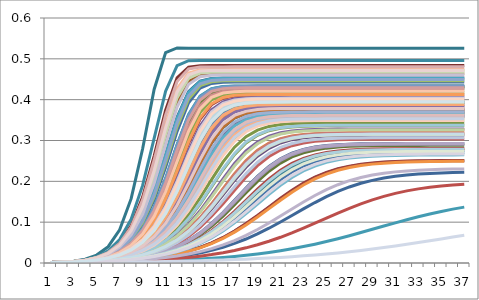
| Category | Series 0 | Series 1 | Series 2 | Series 3 | Series 4 | Series 5 | Series 6 | Series 7 | Series 8 | Series 9 | Series 10 | Series 11 | Series 12 | Series 13 | Series 14 | Series 15 | Series 16 | Series 17 | Series 18 | Series 19 | Series 20 | Series 21 | Series 22 | Series 23 | Series 24 | Series 25 | Series 26 | Series 27 | Series 28 | Series 29 | Series 30 | Series 31 | Series 32 | Series 33 | Series 34 | Series 35 | Series 36 | Series 37 | Series 38 | Series 39 | Series 40 | Series 41 | Series 42 | Series 43 | Series 44 | Series 45 | Series 46 | Series 47 | Series 48 | Series 49 | Series 50 | Series 51 | Series 52 | Series 53 | Series 54 | Series 55 | Series 56 | Series 57 | Series 58 | Series 59 | Series 60 | Series 61 | Series 62 | Series 63 | Series 64 | Series 65 | Series 66 | Series 67 | Series 68 | Series 69 | Series 70 | Series 71 | Series 72 | Series 73 | Series 74 | Series 75 | Series 76 | Series 77 | Series 78 | Series 79 | Series 80 | Series 81 | Series 82 | Series 83 | Series 84 | Series 85 | Series 86 | Series 87 | Series 88 | Series 89 | Series 90 | Series 91 | Series 92 | Series 93 | Series 94 |
|---|---|---|---|---|---|---|---|---|---|---|---|---|---|---|---|---|---|---|---|---|---|---|---|---|---|---|---|---|---|---|---|---|---|---|---|---|---|---|---|---|---|---|---|---|---|---|---|---|---|---|---|---|---|---|---|---|---|---|---|---|---|---|---|---|---|---|---|---|---|---|---|---|---|---|---|---|---|---|---|---|---|---|---|---|---|---|---|---|---|---|---|---|---|---|---|
| 0 | 0.001 | 0.001 | 0.001 | 0.001 | 0.001 | 0.001 | 0.001 | 0.001 | 0.001 | 0.001 | 0.001 | 0.001 | 0.001 | 0.001 | 0.001 | 0.001 | 0.001 | 0.001 | 0.001 | 0.001 | 0.001 | 0.001 | 0.001 | 0.001 | 0.001 | 0.001 | 0.001 | 0.001 | 0.001 | 0.001 | 0.001 | 0.001 | 0.001 | 0.001 | 0.001 | 0.001 | 0.001 | 0.001 | 0.001 | 0.001 | 0.001 | 0.001 | 0.001 | 0.001 | 0.001 | 0.001 | 0.001 | 0.001 | 0.001 | 0.001 | 0.001 | 0.001 | 0.001 | 0.001 | 0.001 | 0.001 | 0.001 | 0.001 | 0.001 | 0.001 | 0.001 | 0.001 | 0.001 | 0.001 | 0.001 | 0.001 | 0.001 | 0.001 | 0.001 | 0.001 | 0.001 | 0.001 | 0.001 | 0.001 | 0.001 | 0.001 | 0.001 | 0.001 | 0.001 | 0.001 | 0.001 | 0.001 | 0.001 | 0.001 | 0.001 | 0.001 | 0.001 | 0.001 | 0.001 | 0.001 | 0.001 | 0.001 | 0.001 | 0.001 | 0.001 |
| 1 | 0.002 | 0.002 | 0.001 | 0.002 | 0.002 | 0.002 | 0.002 | 0.002 | 0.002 | 0.001 | 0.002 | 0.002 | 0.001 | 0.002 | 0.002 | 0.002 | 0.001 | 0.002 | 0.001 | 0.001 | 0.002 | 0.001 | 0.002 | 0.001 | 0.002 | 0.002 | 0.002 | 0.002 | 0.002 | 0.001 | 0.001 | 0.001 | 0.002 | 0.001 | 0.001 | 0.001 | 0.002 | 0.002 | 0.002 | 0.002 | 0.002 | 0.002 | 0.002 | 0.001 | 0.002 | 0.001 | 0.002 | 0.001 | 0.002 | 0.001 | 0.002 | 0.002 | 0.002 | 0.002 | 0.002 | 0.001 | 0.002 | 0.002 | 0.001 | 0.002 | 0.002 | 0.002 | 0.002 | 0.001 | 0.002 | 0.002 | 0.002 | 0.002 | 0.001 | 0.001 | 0.002 | 0.002 | 0.002 | 0.002 | 0.002 | 0.001 | 0.001 | 0.002 | 0.001 | 0.002 | 0.001 | 0.002 | 0.002 | 0.002 | 0.002 | 0.002 | 0.002 | 0.002 | 0.001 | 0.002 | 0.001 | 0.002 | 0.001 | 0.001 | 0.002 |
| 2 | 0.003 | 0.004 | 0.002 | 0.003 | 0.002 | 0.003 | 0.003 | 0.003 | 0.003 | 0.002 | 0.004 | 0.002 | 0.002 | 0.003 | 0.003 | 0.003 | 0.002 | 0.003 | 0.002 | 0.002 | 0.002 | 0.002 | 0.004 | 0.002 | 0.003 | 0.003 | 0.002 | 0.003 | 0.003 | 0.002 | 0.002 | 0.002 | 0.003 | 0.002 | 0.001 | 0.002 | 0.002 | 0.002 | 0.003 | 0.003 | 0.003 | 0.003 | 0.003 | 0.002 | 0.004 | 0.002 | 0.003 | 0.002 | 0.003 | 0.002 | 0.003 | 0.003 | 0.002 | 0.003 | 0.003 | 0.002 | 0.002 | 0.002 | 0.002 | 0.003 | 0.003 | 0.003 | 0.003 | 0.002 | 0.002 | 0.002 | 0.003 | 0.003 | 0.002 | 0.002 | 0.002 | 0.004 | 0.002 | 0.004 | 0.004 | 0.002 | 0.002 | 0.003 | 0.002 | 0.002 | 0.002 | 0.003 | 0.003 | 0.002 | 0.002 | 0.003 | 0.003 | 0.003 | 0.002 | 0.003 | 0.001 | 0.004 | 0.002 | 0.002 | 0.003 |
| 3 | 0.004 | 0.007 | 0.003 | 0.004 | 0.004 | 0.006 | 0.006 | 0.005 | 0.005 | 0.002 | 0.009 | 0.004 | 0.003 | 0.004 | 0.005 | 0.005 | 0.003 | 0.004 | 0.002 | 0.002 | 0.004 | 0.003 | 0.008 | 0.003 | 0.006 | 0.005 | 0.003 | 0.004 | 0.004 | 0.003 | 0.003 | 0.003 | 0.005 | 0.003 | 0.002 | 0.003 | 0.004 | 0.004 | 0.005 | 0.005 | 0.005 | 0.004 | 0.004 | 0.002 | 0.007 | 0.003 | 0.006 | 0.002 | 0.004 | 0.003 | 0.006 | 0.004 | 0.004 | 0.005 | 0.005 | 0.003 | 0.004 | 0.004 | 0.003 | 0.004 | 0.006 | 0.005 | 0.004 | 0.003 | 0.004 | 0.004 | 0.004 | 0.005 | 0.003 | 0.003 | 0.003 | 0.007 | 0.004 | 0.007 | 0.007 | 0.002 | 0.003 | 0.005 | 0.003 | 0.004 | 0.003 | 0.006 | 0.005 | 0.004 | 0.004 | 0.004 | 0.004 | 0.005 | 0.003 | 0.005 | 0.001 | 0.007 | 0.003 | 0.003 | 0.004 |
| 4 | 0.006 | 0.014 | 0.004 | 0.007 | 0.006 | 0.012 | 0.011 | 0.008 | 0.009 | 0.003 | 0.019 | 0.006 | 0.004 | 0.007 | 0.009 | 0.01 | 0.004 | 0.007 | 0.003 | 0.003 | 0.005 | 0.004 | 0.015 | 0.004 | 0.01 | 0.008 | 0.005 | 0.006 | 0.007 | 0.005 | 0.004 | 0.004 | 0.009 | 0.005 | 0.002 | 0.005 | 0.006 | 0.006 | 0.009 | 0.008 | 0.01 | 0.007 | 0.007 | 0.002 | 0.013 | 0.005 | 0.011 | 0.003 | 0.007 | 0.004 | 0.011 | 0.007 | 0.006 | 0.008 | 0.01 | 0.005 | 0.006 | 0.006 | 0.003 | 0.007 | 0.011 | 0.009 | 0.007 | 0.004 | 0.006 | 0.006 | 0.006 | 0.009 | 0.005 | 0.004 | 0.005 | 0.013 | 0.006 | 0.014 | 0.012 | 0.003 | 0.004 | 0.009 | 0.004 | 0.006 | 0.004 | 0.012 | 0.008 | 0.006 | 0.006 | 0.007 | 0.007 | 0.008 | 0.005 | 0.008 | 0.002 | 0.013 | 0.004 | 0.003 | 0.007 |
| 5 | 0.01 | 0.026 | 0.005 | 0.011 | 0.01 | 0.022 | 0.02 | 0.012 | 0.016 | 0.004 | 0.04 | 0.01 | 0.006 | 0.01 | 0.016 | 0.017 | 0.005 | 0.01 | 0.004 | 0.004 | 0.008 | 0.006 | 0.03 | 0.005 | 0.018 | 0.014 | 0.008 | 0.01 | 0.012 | 0.007 | 0.005 | 0.005 | 0.015 | 0.007 | 0.002 | 0.007 | 0.009 | 0.009 | 0.017 | 0.013 | 0.017 | 0.011 | 0.012 | 0.003 | 0.024 | 0.007 | 0.02 | 0.004 | 0.012 | 0.006 | 0.019 | 0.011 | 0.01 | 0.014 | 0.017 | 0.007 | 0.009 | 0.009 | 0.005 | 0.011 | 0.019 | 0.015 | 0.012 | 0.006 | 0.009 | 0.009 | 0.01 | 0.016 | 0.007 | 0.006 | 0.008 | 0.024 | 0.009 | 0.026 | 0.023 | 0.004 | 0.005 | 0.015 | 0.006 | 0.009 | 0.007 | 0.021 | 0.012 | 0.008 | 0.009 | 0.011 | 0.012 | 0.013 | 0.007 | 0.013 | 0.002 | 0.024 | 0.005 | 0.005 | 0.012 |
| 6 | 0.016 | 0.05 | 0.008 | 0.018 | 0.015 | 0.04 | 0.036 | 0.02 | 0.027 | 0.006 | 0.081 | 0.015 | 0.008 | 0.017 | 0.028 | 0.029 | 0.007 | 0.016 | 0.005 | 0.006 | 0.012 | 0.009 | 0.057 | 0.007 | 0.032 | 0.023 | 0.011 | 0.015 | 0.019 | 0.011 | 0.007 | 0.007 | 0.025 | 0.01 | 0.003 | 0.01 | 0.014 | 0.014 | 0.029 | 0.022 | 0.029 | 0.018 | 0.019 | 0.004 | 0.044 | 0.011 | 0.036 | 0.006 | 0.019 | 0.009 | 0.033 | 0.018 | 0.015 | 0.024 | 0.029 | 0.01 | 0.013 | 0.014 | 0.006 | 0.019 | 0.034 | 0.026 | 0.02 | 0.008 | 0.014 | 0.014 | 0.016 | 0.028 | 0.01 | 0.008 | 0.012 | 0.045 | 0.014 | 0.048 | 0.042 | 0.005 | 0.007 | 0.026 | 0.009 | 0.014 | 0.009 | 0.039 | 0.02 | 0.013 | 0.013 | 0.017 | 0.02 | 0.022 | 0.01 | 0.021 | 0.002 | 0.044 | 0.007 | 0.006 | 0.02 |
| 7 | 0.026 | 0.092 | 0.011 | 0.029 | 0.024 | 0.072 | 0.063 | 0.033 | 0.046 | 0.007 | 0.158 | 0.024 | 0.011 | 0.026 | 0.049 | 0.05 | 0.009 | 0.026 | 0.006 | 0.007 | 0.018 | 0.013 | 0.107 | 0.01 | 0.056 | 0.039 | 0.017 | 0.024 | 0.031 | 0.016 | 0.009 | 0.01 | 0.041 | 0.014 | 0.003 | 0.014 | 0.022 | 0.022 | 0.049 | 0.036 | 0.05 | 0.029 | 0.031 | 0.005 | 0.08 | 0.016 | 0.063 | 0.007 | 0.031 | 0.012 | 0.058 | 0.028 | 0.023 | 0.039 | 0.049 | 0.014 | 0.02 | 0.022 | 0.008 | 0.03 | 0.06 | 0.045 | 0.032 | 0.011 | 0.022 | 0.021 | 0.024 | 0.048 | 0.015 | 0.011 | 0.017 | 0.082 | 0.022 | 0.088 | 0.075 | 0.006 | 0.01 | 0.043 | 0.013 | 0.022 | 0.014 | 0.069 | 0.033 | 0.02 | 0.02 | 0.027 | 0.032 | 0.035 | 0.014 | 0.034 | 0.003 | 0.079 | 0.009 | 0.009 | 0.032 |
| 8 | 0.04 | 0.161 | 0.015 | 0.045 | 0.037 | 0.124 | 0.108 | 0.053 | 0.077 | 0.01 | 0.28 | 0.036 | 0.015 | 0.041 | 0.081 | 0.083 | 0.013 | 0.04 | 0.007 | 0.01 | 0.027 | 0.019 | 0.19 | 0.013 | 0.095 | 0.063 | 0.025 | 0.037 | 0.05 | 0.023 | 0.012 | 0.013 | 0.068 | 0.02 | 0.004 | 0.021 | 0.033 | 0.034 | 0.082 | 0.059 | 0.084 | 0.046 | 0.05 | 0.006 | 0.139 | 0.023 | 0.107 | 0.01 | 0.049 | 0.017 | 0.099 | 0.044 | 0.036 | 0.064 | 0.082 | 0.021 | 0.03 | 0.033 | 0.011 | 0.047 | 0.103 | 0.074 | 0.051 | 0.015 | 0.034 | 0.032 | 0.038 | 0.079 | 0.023 | 0.015 | 0.026 | 0.143 | 0.033 | 0.155 | 0.13 | 0.008 | 0.013 | 0.071 | 0.018 | 0.034 | 0.02 | 0.119 | 0.053 | 0.029 | 0.031 | 0.042 | 0.051 | 0.057 | 0.02 | 0.056 | 0.003 | 0.138 | 0.012 | 0.012 | 0.051 |
| 9 | 0.062 | 0.262 | 0.02 | 0.07 | 0.056 | 0.202 | 0.176 | 0.084 | 0.125 | 0.013 | 0.425 | 0.055 | 0.021 | 0.063 | 0.131 | 0.135 | 0.017 | 0.062 | 0.009 | 0.013 | 0.041 | 0.028 | 0.305 | 0.018 | 0.154 | 0.101 | 0.037 | 0.057 | 0.078 | 0.033 | 0.016 | 0.018 | 0.109 | 0.028 | 0.005 | 0.03 | 0.05 | 0.051 | 0.132 | 0.093 | 0.136 | 0.072 | 0.079 | 0.007 | 0.226 | 0.034 | 0.175 | 0.013 | 0.077 | 0.024 | 0.161 | 0.069 | 0.054 | 0.103 | 0.133 | 0.029 | 0.045 | 0.05 | 0.015 | 0.073 | 0.167 | 0.119 | 0.079 | 0.021 | 0.051 | 0.048 | 0.058 | 0.128 | 0.033 | 0.021 | 0.038 | 0.233 | 0.05 | 0.252 | 0.213 | 0.01 | 0.018 | 0.114 | 0.026 | 0.052 | 0.028 | 0.194 | 0.084 | 0.044 | 0.046 | 0.065 | 0.08 | 0.091 | 0.029 | 0.088 | 0.003 | 0.225 | 0.017 | 0.016 | 0.08 |
| 10 | 0.092 | 0.374 | 0.028 | 0.105 | 0.084 | 0.301 | 0.266 | 0.127 | 0.19 | 0.017 | 0.515 | 0.082 | 0.03 | 0.095 | 0.201 | 0.206 | 0.024 | 0.093 | 0.012 | 0.017 | 0.06 | 0.039 | 0.421 | 0.025 | 0.234 | 0.154 | 0.054 | 0.085 | 0.119 | 0.047 | 0.022 | 0.025 | 0.167 | 0.04 | 0.006 | 0.042 | 0.074 | 0.075 | 0.202 | 0.142 | 0.207 | 0.109 | 0.119 | 0.009 | 0.332 | 0.048 | 0.264 | 0.017 | 0.117 | 0.034 | 0.245 | 0.104 | 0.081 | 0.157 | 0.204 | 0.042 | 0.066 | 0.074 | 0.021 | 0.111 | 0.253 | 0.181 | 0.121 | 0.029 | 0.075 | 0.071 | 0.086 | 0.196 | 0.047 | 0.03 | 0.055 | 0.34 | 0.075 | 0.362 | 0.315 | 0.013 | 0.025 | 0.174 | 0.036 | 0.077 | 0.04 | 0.29 | 0.128 | 0.064 | 0.068 | 0.097 | 0.121 | 0.138 | 0.041 | 0.134 | 0.004 | 0.33 | 0.023 | 0.021 | 0.122 |
| 11 | 0.134 | 0.453 | 0.038 | 0.153 | 0.121 | 0.392 | 0.357 | 0.185 | 0.269 | 0.022 | 0.527 | 0.119 | 0.041 | 0.137 | 0.282 | 0.289 | 0.032 | 0.135 | 0.015 | 0.023 | 0.085 | 0.054 | 0.483 | 0.033 | 0.322 | 0.221 | 0.077 | 0.124 | 0.173 | 0.067 | 0.03 | 0.034 | 0.239 | 0.056 | 0.007 | 0.06 | 0.107 | 0.109 | 0.283 | 0.205 | 0.29 | 0.159 | 0.173 | 0.011 | 0.42 | 0.068 | 0.355 | 0.022 | 0.17 | 0.048 | 0.334 | 0.151 | 0.117 | 0.225 | 0.286 | 0.059 | 0.096 | 0.106 | 0.027 | 0.162 | 0.343 | 0.258 | 0.175 | 0.04 | 0.109 | 0.102 | 0.125 | 0.276 | 0.066 | 0.041 | 0.078 | 0.427 | 0.108 | 0.445 | 0.405 | 0.017 | 0.033 | 0.249 | 0.05 | 0.111 | 0.056 | 0.382 | 0.185 | 0.093 | 0.098 | 0.141 | 0.176 | 0.2 | 0.057 | 0.193 | 0.004 | 0.419 | 0.031 | 0.028 | 0.177 |
| 12 | 0.186 | 0.48 | 0.051 | 0.211 | 0.169 | 0.444 | 0.42 | 0.25 | 0.343 | 0.029 | 0.526 | 0.166 | 0.055 | 0.19 | 0.356 | 0.362 | 0.043 | 0.187 | 0.02 | 0.03 | 0.119 | 0.075 | 0.495 | 0.045 | 0.392 | 0.293 | 0.107 | 0.172 | 0.235 | 0.093 | 0.04 | 0.046 | 0.312 | 0.078 | 0.008 | 0.082 | 0.149 | 0.152 | 0.357 | 0.275 | 0.364 | 0.218 | 0.236 | 0.014 | 0.461 | 0.095 | 0.418 | 0.029 | 0.232 | 0.065 | 0.402 | 0.208 | 0.163 | 0.297 | 0.359 | 0.081 | 0.133 | 0.148 | 0.036 | 0.221 | 0.409 | 0.332 | 0.239 | 0.054 | 0.151 | 0.142 | 0.174 | 0.35 | 0.092 | 0.055 | 0.109 | 0.465 | 0.151 | 0.475 | 0.452 | 0.022 | 0.045 | 0.323 | 0.068 | 0.154 | 0.077 | 0.437 | 0.251 | 0.129 | 0.137 | 0.195 | 0.239 | 0.268 | 0.078 | 0.26 | 0.005 | 0.461 | 0.041 | 0.037 | 0.24 |
| 13 | 0.242 | 0.483 | 0.069 | 0.27 | 0.222 | 0.46 | 0.445 | 0.311 | 0.394 | 0.038 | 0.526 | 0.219 | 0.074 | 0.247 | 0.403 | 0.408 | 0.056 | 0.243 | 0.025 | 0.038 | 0.159 | 0.101 | 0.496 | 0.059 | 0.428 | 0.352 | 0.144 | 0.225 | 0.296 | 0.125 | 0.052 | 0.061 | 0.369 | 0.105 | 0.01 | 0.111 | 0.197 | 0.201 | 0.404 | 0.335 | 0.409 | 0.278 | 0.297 | 0.017 | 0.471 | 0.128 | 0.444 | 0.037 | 0.293 | 0.087 | 0.434 | 0.267 | 0.215 | 0.356 | 0.406 | 0.11 | 0.178 | 0.197 | 0.047 | 0.282 | 0.439 | 0.385 | 0.3 | 0.072 | 0.201 | 0.19 | 0.228 | 0.399 | 0.124 | 0.074 | 0.146 | 0.473 | 0.2 | 0.48 | 0.465 | 0.028 | 0.059 | 0.377 | 0.092 | 0.205 | 0.104 | 0.456 | 0.312 | 0.173 | 0.183 | 0.253 | 0.3 | 0.329 | 0.106 | 0.322 | 0.006 | 0.47 | 0.054 | 0.049 | 0.302 |
| 14 | 0.294 | 0.483 | 0.09 | 0.32 | 0.273 | 0.463 | 0.452 | 0.356 | 0.417 | 0.049 | 0.526 | 0.27 | 0.097 | 0.298 | 0.423 | 0.426 | 0.073 | 0.295 | 0.031 | 0.049 | 0.204 | 0.132 | 0.496 | 0.077 | 0.44 | 0.388 | 0.186 | 0.277 | 0.343 | 0.163 | 0.068 | 0.079 | 0.4 | 0.137 | 0.011 | 0.145 | 0.247 | 0.251 | 0.424 | 0.375 | 0.427 | 0.327 | 0.344 | 0.021 | 0.472 | 0.166 | 0.451 | 0.048 | 0.341 | 0.114 | 0.444 | 0.317 | 0.266 | 0.39 | 0.425 | 0.143 | 0.226 | 0.246 | 0.061 | 0.331 | 0.447 | 0.411 | 0.346 | 0.094 | 0.251 | 0.239 | 0.28 | 0.42 | 0.161 | 0.096 | 0.189 | 0.474 | 0.25 | 0.48 | 0.467 | 0.035 | 0.077 | 0.406 | 0.12 | 0.255 | 0.136 | 0.46 | 0.357 | 0.22 | 0.231 | 0.304 | 0.347 | 0.37 | 0.138 | 0.365 | 0.006 | 0.472 | 0.071 | 0.064 | 0.348 |
| 15 | 0.332 | 0.483 | 0.115 | 0.354 | 0.314 | 0.463 | 0.453 | 0.381 | 0.424 | 0.062 | 0.526 | 0.311 | 0.124 | 0.336 | 0.429 | 0.431 | 0.094 | 0.333 | 0.039 | 0.063 | 0.247 | 0.167 | 0.496 | 0.099 | 0.442 | 0.403 | 0.228 | 0.317 | 0.371 | 0.203 | 0.087 | 0.101 | 0.412 | 0.173 | 0.014 | 0.182 | 0.29 | 0.294 | 0.43 | 0.395 | 0.432 | 0.359 | 0.372 | 0.025 | 0.472 | 0.206 | 0.452 | 0.06 | 0.37 | 0.145 | 0.446 | 0.351 | 0.307 | 0.405 | 0.43 | 0.18 | 0.269 | 0.29 | 0.079 | 0.362 | 0.449 | 0.42 | 0.374 | 0.12 | 0.294 | 0.282 | 0.32 | 0.427 | 0.201 | 0.123 | 0.231 | 0.474 | 0.293 | 0.48 | 0.467 | 0.044 | 0.098 | 0.416 | 0.153 | 0.298 | 0.171 | 0.46 | 0.381 | 0.263 | 0.274 | 0.341 | 0.374 | 0.391 | 0.174 | 0.387 | 0.007 | 0.472 | 0.09 | 0.081 | 0.375 |
| 16 | 0.355 | 0.483 | 0.143 | 0.371 | 0.341 | 0.463 | 0.453 | 0.392 | 0.427 | 0.077 | 0.526 | 0.338 | 0.153 | 0.358 | 0.431 | 0.433 | 0.118 | 0.355 | 0.048 | 0.078 | 0.284 | 0.202 | 0.496 | 0.124 | 0.443 | 0.409 | 0.266 | 0.343 | 0.385 | 0.24 | 0.108 | 0.127 | 0.416 | 0.209 | 0.016 | 0.219 | 0.321 | 0.325 | 0.431 | 0.402 | 0.433 | 0.375 | 0.385 | 0.031 | 0.472 | 0.244 | 0.453 | 0.076 | 0.383 | 0.178 | 0.446 | 0.369 | 0.335 | 0.411 | 0.432 | 0.216 | 0.304 | 0.321 | 0.098 | 0.377 | 0.449 | 0.423 | 0.386 | 0.149 | 0.324 | 0.314 | 0.345 | 0.429 | 0.238 | 0.152 | 0.268 | 0.474 | 0.324 | 0.48 | 0.467 | 0.055 | 0.123 | 0.42 | 0.187 | 0.327 | 0.207 | 0.46 | 0.392 | 0.298 | 0.308 | 0.361 | 0.387 | 0.399 | 0.21 | 0.396 | 0.008 | 0.472 | 0.113 | 0.102 | 0.387 |
| 17 | 0.366 | 0.483 | 0.172 | 0.379 | 0.356 | 0.463 | 0.453 | 0.396 | 0.427 | 0.095 | 0.526 | 0.354 | 0.184 | 0.369 | 0.431 | 0.433 | 0.143 | 0.367 | 0.059 | 0.097 | 0.31 | 0.235 | 0.496 | 0.151 | 0.443 | 0.411 | 0.294 | 0.357 | 0.39 | 0.271 | 0.133 | 0.154 | 0.417 | 0.241 | 0.019 | 0.251 | 0.34 | 0.343 | 0.432 | 0.405 | 0.434 | 0.382 | 0.39 | 0.037 | 0.472 | 0.274 | 0.453 | 0.093 | 0.389 | 0.21 | 0.447 | 0.378 | 0.351 | 0.412 | 0.432 | 0.249 | 0.326 | 0.34 | 0.121 | 0.384 | 0.449 | 0.423 | 0.391 | 0.179 | 0.342 | 0.335 | 0.359 | 0.429 | 0.269 | 0.183 | 0.296 | 0.474 | 0.342 | 0.48 | 0.467 | 0.068 | 0.15 | 0.42 | 0.219 | 0.345 | 0.239 | 0.46 | 0.396 | 0.321 | 0.329 | 0.371 | 0.391 | 0.402 | 0.243 | 0.4 | 0.009 | 0.472 | 0.138 | 0.125 | 0.392 |
| 18 | 0.371 | 0.483 | 0.2 | 0.382 | 0.363 | 0.463 | 0.453 | 0.397 | 0.427 | 0.115 | 0.526 | 0.361 | 0.212 | 0.373 | 0.431 | 0.433 | 0.169 | 0.372 | 0.071 | 0.116 | 0.326 | 0.261 | 0.496 | 0.177 | 0.443 | 0.411 | 0.313 | 0.364 | 0.392 | 0.294 | 0.158 | 0.181 | 0.417 | 0.267 | 0.022 | 0.276 | 0.35 | 0.352 | 0.432 | 0.406 | 0.434 | 0.385 | 0.392 | 0.045 | 0.472 | 0.297 | 0.453 | 0.113 | 0.391 | 0.238 | 0.447 | 0.381 | 0.359 | 0.413 | 0.432 | 0.274 | 0.339 | 0.35 | 0.144 | 0.387 | 0.449 | 0.424 | 0.393 | 0.207 | 0.352 | 0.346 | 0.365 | 0.429 | 0.292 | 0.211 | 0.315 | 0.474 | 0.352 | 0.48 | 0.467 | 0.082 | 0.176 | 0.421 | 0.247 | 0.354 | 0.266 | 0.46 | 0.397 | 0.335 | 0.341 | 0.376 | 0.393 | 0.403 | 0.269 | 0.401 | 0.011 | 0.472 | 0.164 | 0.149 | 0.394 |
| 19 | 0.374 | 0.483 | 0.225 | 0.384 | 0.366 | 0.463 | 0.453 | 0.398 | 0.427 | 0.136 | 0.526 | 0.364 | 0.236 | 0.375 | 0.431 | 0.433 | 0.194 | 0.374 | 0.085 | 0.138 | 0.334 | 0.281 | 0.496 | 0.202 | 0.443 | 0.412 | 0.324 | 0.367 | 0.393 | 0.308 | 0.182 | 0.206 | 0.418 | 0.286 | 0.026 | 0.293 | 0.355 | 0.357 | 0.432 | 0.406 | 0.434 | 0.386 | 0.393 | 0.053 | 0.472 | 0.311 | 0.453 | 0.133 | 0.392 | 0.261 | 0.447 | 0.382 | 0.363 | 0.413 | 0.432 | 0.292 | 0.345 | 0.355 | 0.168 | 0.388 | 0.449 | 0.424 | 0.394 | 0.232 | 0.356 | 0.351 | 0.368 | 0.429 | 0.307 | 0.235 | 0.326 | 0.474 | 0.356 | 0.48 | 0.467 | 0.098 | 0.201 | 0.421 | 0.268 | 0.358 | 0.285 | 0.46 | 0.398 | 0.342 | 0.348 | 0.377 | 0.394 | 0.404 | 0.287 | 0.401 | 0.012 | 0.472 | 0.188 | 0.173 | 0.394 |
| 20 | 0.374 | 0.483 | 0.245 | 0.384 | 0.367 | 0.463 | 0.453 | 0.398 | 0.427 | 0.157 | 0.526 | 0.366 | 0.255 | 0.376 | 0.431 | 0.433 | 0.216 | 0.375 | 0.1 | 0.158 | 0.339 | 0.294 | 0.496 | 0.224 | 0.443 | 0.412 | 0.33 | 0.368 | 0.393 | 0.317 | 0.204 | 0.227 | 0.418 | 0.298 | 0.03 | 0.304 | 0.357 | 0.359 | 0.432 | 0.406 | 0.434 | 0.387 | 0.393 | 0.063 | 0.472 | 0.319 | 0.453 | 0.154 | 0.392 | 0.277 | 0.447 | 0.383 | 0.364 | 0.413 | 0.432 | 0.303 | 0.349 | 0.357 | 0.19 | 0.388 | 0.449 | 0.424 | 0.394 | 0.251 | 0.359 | 0.354 | 0.369 | 0.429 | 0.316 | 0.254 | 0.331 | 0.474 | 0.358 | 0.48 | 0.467 | 0.115 | 0.223 | 0.421 | 0.283 | 0.36 | 0.297 | 0.46 | 0.398 | 0.346 | 0.351 | 0.378 | 0.394 | 0.404 | 0.299 | 0.401 | 0.014 | 0.472 | 0.21 | 0.196 | 0.395 |
| 21 | 0.375 | 0.483 | 0.26 | 0.384 | 0.368 | 0.463 | 0.453 | 0.398 | 0.427 | 0.177 | 0.526 | 0.366 | 0.269 | 0.376 | 0.431 | 0.433 | 0.234 | 0.375 | 0.116 | 0.178 | 0.341 | 0.302 | 0.496 | 0.241 | 0.443 | 0.412 | 0.333 | 0.369 | 0.393 | 0.322 | 0.223 | 0.244 | 0.418 | 0.306 | 0.035 | 0.311 | 0.358 | 0.36 | 0.432 | 0.406 | 0.434 | 0.387 | 0.393 | 0.074 | 0.472 | 0.323 | 0.453 | 0.173 | 0.392 | 0.287 | 0.447 | 0.383 | 0.365 | 0.413 | 0.432 | 0.31 | 0.35 | 0.358 | 0.21 | 0.388 | 0.449 | 0.424 | 0.394 | 0.265 | 0.359 | 0.355 | 0.37 | 0.429 | 0.321 | 0.268 | 0.334 | 0.474 | 0.359 | 0.48 | 0.467 | 0.132 | 0.24 | 0.421 | 0.293 | 0.361 | 0.305 | 0.46 | 0.398 | 0.348 | 0.352 | 0.378 | 0.394 | 0.404 | 0.306 | 0.401 | 0.016 | 0.472 | 0.229 | 0.215 | 0.395 |
| 22 | 0.375 | 0.483 | 0.27 | 0.384 | 0.368 | 0.463 | 0.453 | 0.398 | 0.427 | 0.194 | 0.526 | 0.367 | 0.278 | 0.377 | 0.431 | 0.433 | 0.247 | 0.375 | 0.132 | 0.196 | 0.342 | 0.307 | 0.496 | 0.254 | 0.443 | 0.412 | 0.335 | 0.369 | 0.393 | 0.324 | 0.238 | 0.256 | 0.418 | 0.31 | 0.04 | 0.315 | 0.359 | 0.36 | 0.432 | 0.406 | 0.434 | 0.387 | 0.393 | 0.085 | 0.472 | 0.326 | 0.453 | 0.191 | 0.392 | 0.294 | 0.447 | 0.383 | 0.365 | 0.413 | 0.432 | 0.314 | 0.351 | 0.358 | 0.225 | 0.388 | 0.449 | 0.424 | 0.394 | 0.275 | 0.36 | 0.356 | 0.37 | 0.429 | 0.323 | 0.277 | 0.336 | 0.474 | 0.36 | 0.48 | 0.467 | 0.149 | 0.253 | 0.421 | 0.299 | 0.361 | 0.309 | 0.46 | 0.398 | 0.348 | 0.353 | 0.379 | 0.394 | 0.404 | 0.311 | 0.401 | 0.018 | 0.472 | 0.243 | 0.23 | 0.395 |
| 23 | 0.375 | 0.483 | 0.277 | 0.384 | 0.368 | 0.463 | 0.453 | 0.398 | 0.427 | 0.209 | 0.526 | 0.367 | 0.284 | 0.377 | 0.431 | 0.433 | 0.257 | 0.375 | 0.148 | 0.21 | 0.343 | 0.309 | 0.496 | 0.263 | 0.443 | 0.412 | 0.336 | 0.369 | 0.393 | 0.326 | 0.248 | 0.265 | 0.418 | 0.312 | 0.046 | 0.317 | 0.359 | 0.36 | 0.432 | 0.406 | 0.434 | 0.387 | 0.393 | 0.097 | 0.472 | 0.327 | 0.453 | 0.206 | 0.392 | 0.298 | 0.447 | 0.383 | 0.365 | 0.413 | 0.432 | 0.316 | 0.351 | 0.359 | 0.237 | 0.388 | 0.449 | 0.424 | 0.394 | 0.281 | 0.36 | 0.356 | 0.37 | 0.429 | 0.325 | 0.283 | 0.337 | 0.474 | 0.36 | 0.48 | 0.467 | 0.165 | 0.262 | 0.421 | 0.302 | 0.362 | 0.312 | 0.46 | 0.398 | 0.349 | 0.353 | 0.379 | 0.394 | 0.404 | 0.313 | 0.401 | 0.02 | 0.472 | 0.253 | 0.242 | 0.395 |
| 24 | 0.375 | 0.483 | 0.281 | 0.384 | 0.368 | 0.463 | 0.453 | 0.398 | 0.427 | 0.221 | 0.526 | 0.367 | 0.287 | 0.377 | 0.431 | 0.433 | 0.264 | 0.375 | 0.162 | 0.222 | 0.343 | 0.311 | 0.496 | 0.269 | 0.443 | 0.412 | 0.336 | 0.369 | 0.393 | 0.326 | 0.256 | 0.271 | 0.418 | 0.314 | 0.053 | 0.318 | 0.359 | 0.36 | 0.432 | 0.406 | 0.434 | 0.387 | 0.393 | 0.11 | 0.472 | 0.328 | 0.453 | 0.218 | 0.392 | 0.3 | 0.447 | 0.383 | 0.365 | 0.413 | 0.432 | 0.317 | 0.351 | 0.359 | 0.246 | 0.388 | 0.449 | 0.424 | 0.394 | 0.285 | 0.36 | 0.356 | 0.37 | 0.429 | 0.325 | 0.287 | 0.337 | 0.474 | 0.36 | 0.48 | 0.467 | 0.18 | 0.268 | 0.421 | 0.304 | 0.362 | 0.313 | 0.46 | 0.398 | 0.349 | 0.353 | 0.379 | 0.394 | 0.404 | 0.314 | 0.401 | 0.022 | 0.472 | 0.26 | 0.25 | 0.395 |
| 25 | 0.375 | 0.483 | 0.284 | 0.384 | 0.368 | 0.463 | 0.453 | 0.398 | 0.427 | 0.229 | 0.526 | 0.367 | 0.29 | 0.377 | 0.431 | 0.433 | 0.268 | 0.375 | 0.175 | 0.231 | 0.343 | 0.312 | 0.496 | 0.273 | 0.443 | 0.412 | 0.336 | 0.369 | 0.393 | 0.327 | 0.261 | 0.274 | 0.418 | 0.314 | 0.06 | 0.318 | 0.359 | 0.36 | 0.432 | 0.406 | 0.434 | 0.387 | 0.393 | 0.122 | 0.472 | 0.328 | 0.453 | 0.227 | 0.392 | 0.302 | 0.447 | 0.383 | 0.365 | 0.413 | 0.432 | 0.317 | 0.351 | 0.359 | 0.253 | 0.388 | 0.449 | 0.424 | 0.394 | 0.287 | 0.36 | 0.356 | 0.37 | 0.429 | 0.326 | 0.289 | 0.337 | 0.474 | 0.36 | 0.48 | 0.467 | 0.192 | 0.272 | 0.421 | 0.305 | 0.362 | 0.314 | 0.46 | 0.398 | 0.349 | 0.353 | 0.379 | 0.394 | 0.404 | 0.315 | 0.401 | 0.025 | 0.472 | 0.265 | 0.256 | 0.395 |
| 26 | 0.375 | 0.483 | 0.286 | 0.384 | 0.368 | 0.463 | 0.453 | 0.398 | 0.427 | 0.236 | 0.526 | 0.367 | 0.291 | 0.377 | 0.431 | 0.433 | 0.271 | 0.375 | 0.186 | 0.237 | 0.343 | 0.312 | 0.496 | 0.275 | 0.443 | 0.412 | 0.336 | 0.369 | 0.393 | 0.327 | 0.265 | 0.277 | 0.418 | 0.315 | 0.067 | 0.319 | 0.359 | 0.36 | 0.432 | 0.406 | 0.434 | 0.387 | 0.393 | 0.134 | 0.472 | 0.328 | 0.453 | 0.234 | 0.392 | 0.302 | 0.447 | 0.383 | 0.365 | 0.413 | 0.432 | 0.318 | 0.351 | 0.359 | 0.257 | 0.388 | 0.449 | 0.424 | 0.394 | 0.289 | 0.36 | 0.356 | 0.37 | 0.429 | 0.326 | 0.291 | 0.337 | 0.474 | 0.36 | 0.48 | 0.467 | 0.202 | 0.274 | 0.421 | 0.306 | 0.362 | 0.314 | 0.46 | 0.398 | 0.349 | 0.353 | 0.379 | 0.394 | 0.404 | 0.315 | 0.401 | 0.028 | 0.472 | 0.268 | 0.26 | 0.395 |
| 27 | 0.375 | 0.483 | 0.287 | 0.384 | 0.368 | 0.463 | 0.453 | 0.398 | 0.427 | 0.241 | 0.526 | 0.367 | 0.292 | 0.377 | 0.431 | 0.433 | 0.273 | 0.375 | 0.195 | 0.242 | 0.343 | 0.312 | 0.496 | 0.277 | 0.443 | 0.412 | 0.337 | 0.369 | 0.393 | 0.327 | 0.267 | 0.278 | 0.418 | 0.315 | 0.075 | 0.319 | 0.359 | 0.36 | 0.432 | 0.406 | 0.434 | 0.387 | 0.393 | 0.145 | 0.472 | 0.328 | 0.453 | 0.239 | 0.392 | 0.303 | 0.447 | 0.383 | 0.365 | 0.413 | 0.432 | 0.318 | 0.351 | 0.359 | 0.26 | 0.388 | 0.449 | 0.424 | 0.394 | 0.29 | 0.36 | 0.356 | 0.37 | 0.429 | 0.326 | 0.291 | 0.337 | 0.474 | 0.36 | 0.48 | 0.467 | 0.209 | 0.276 | 0.421 | 0.306 | 0.362 | 0.314 | 0.46 | 0.398 | 0.349 | 0.353 | 0.379 | 0.394 | 0.404 | 0.316 | 0.401 | 0.031 | 0.472 | 0.27 | 0.262 | 0.395 |
| 28 | 0.375 | 0.483 | 0.287 | 0.384 | 0.368 | 0.463 | 0.453 | 0.398 | 0.427 | 0.244 | 0.526 | 0.367 | 0.292 | 0.377 | 0.431 | 0.433 | 0.274 | 0.375 | 0.202 | 0.245 | 0.343 | 0.313 | 0.496 | 0.277 | 0.443 | 0.412 | 0.337 | 0.369 | 0.393 | 0.327 | 0.268 | 0.279 | 0.418 | 0.315 | 0.083 | 0.319 | 0.359 | 0.36 | 0.432 | 0.406 | 0.434 | 0.387 | 0.393 | 0.155 | 0.472 | 0.328 | 0.453 | 0.242 | 0.392 | 0.303 | 0.447 | 0.383 | 0.365 | 0.413 | 0.432 | 0.318 | 0.351 | 0.359 | 0.262 | 0.388 | 0.449 | 0.424 | 0.394 | 0.29 | 0.36 | 0.356 | 0.37 | 0.429 | 0.326 | 0.292 | 0.338 | 0.474 | 0.36 | 0.48 | 0.467 | 0.215 | 0.277 | 0.421 | 0.307 | 0.362 | 0.314 | 0.46 | 0.398 | 0.349 | 0.353 | 0.379 | 0.394 | 0.404 | 0.316 | 0.401 | 0.034 | 0.472 | 0.271 | 0.264 | 0.395 |
| 29 | 0.375 | 0.483 | 0.288 | 0.384 | 0.368 | 0.463 | 0.453 | 0.398 | 0.427 | 0.246 | 0.526 | 0.367 | 0.293 | 0.377 | 0.431 | 0.433 | 0.275 | 0.375 | 0.208 | 0.247 | 0.343 | 0.313 | 0.496 | 0.278 | 0.443 | 0.412 | 0.337 | 0.369 | 0.393 | 0.327 | 0.269 | 0.28 | 0.418 | 0.315 | 0.091 | 0.319 | 0.359 | 0.36 | 0.432 | 0.406 | 0.434 | 0.387 | 0.393 | 0.163 | 0.472 | 0.328 | 0.453 | 0.245 | 0.392 | 0.303 | 0.447 | 0.383 | 0.365 | 0.413 | 0.432 | 0.318 | 0.351 | 0.359 | 0.263 | 0.388 | 0.449 | 0.424 | 0.394 | 0.291 | 0.36 | 0.356 | 0.37 | 0.429 | 0.326 | 0.292 | 0.338 | 0.474 | 0.36 | 0.48 | 0.467 | 0.22 | 0.278 | 0.421 | 0.307 | 0.362 | 0.315 | 0.46 | 0.398 | 0.349 | 0.353 | 0.379 | 0.394 | 0.404 | 0.316 | 0.401 | 0.038 | 0.472 | 0.272 | 0.265 | 0.395 |
| 30 | 0.375 | 0.483 | 0.288 | 0.384 | 0.368 | 0.463 | 0.453 | 0.398 | 0.427 | 0.248 | 0.526 | 0.367 | 0.293 | 0.377 | 0.431 | 0.433 | 0.275 | 0.375 | 0.212 | 0.249 | 0.343 | 0.313 | 0.496 | 0.278 | 0.443 | 0.412 | 0.337 | 0.369 | 0.393 | 0.327 | 0.27 | 0.28 | 0.418 | 0.315 | 0.098 | 0.319 | 0.359 | 0.36 | 0.432 | 0.406 | 0.434 | 0.387 | 0.393 | 0.17 | 0.472 | 0.328 | 0.453 | 0.246 | 0.392 | 0.303 | 0.447 | 0.383 | 0.365 | 0.413 | 0.432 | 0.318 | 0.351 | 0.359 | 0.264 | 0.388 | 0.449 | 0.424 | 0.394 | 0.291 | 0.36 | 0.356 | 0.37 | 0.429 | 0.326 | 0.292 | 0.338 | 0.474 | 0.36 | 0.48 | 0.467 | 0.223 | 0.278 | 0.421 | 0.307 | 0.362 | 0.315 | 0.46 | 0.398 | 0.349 | 0.353 | 0.379 | 0.394 | 0.404 | 0.316 | 0.401 | 0.042 | 0.472 | 0.272 | 0.266 | 0.395 |
| 31 | 0.375 | 0.483 | 0.288 | 0.384 | 0.368 | 0.463 | 0.453 | 0.398 | 0.427 | 0.249 | 0.526 | 0.367 | 0.293 | 0.377 | 0.431 | 0.433 | 0.275 | 0.375 | 0.215 | 0.25 | 0.343 | 0.313 | 0.496 | 0.279 | 0.443 | 0.412 | 0.337 | 0.369 | 0.393 | 0.327 | 0.27 | 0.28 | 0.418 | 0.315 | 0.106 | 0.319 | 0.359 | 0.36 | 0.432 | 0.406 | 0.434 | 0.387 | 0.393 | 0.177 | 0.472 | 0.328 | 0.453 | 0.247 | 0.392 | 0.303 | 0.447 | 0.383 | 0.365 | 0.413 | 0.432 | 0.318 | 0.351 | 0.359 | 0.264 | 0.388 | 0.449 | 0.424 | 0.394 | 0.291 | 0.36 | 0.356 | 0.37 | 0.429 | 0.326 | 0.292 | 0.338 | 0.474 | 0.36 | 0.48 | 0.467 | 0.226 | 0.278 | 0.421 | 0.307 | 0.362 | 0.315 | 0.46 | 0.398 | 0.349 | 0.353 | 0.379 | 0.394 | 0.404 | 0.316 | 0.401 | 0.046 | 0.472 | 0.273 | 0.266 | 0.395 |
| 32 | 0.375 | 0.483 | 0.288 | 0.384 | 0.368 | 0.463 | 0.453 | 0.398 | 0.427 | 0.249 | 0.526 | 0.367 | 0.293 | 0.377 | 0.431 | 0.433 | 0.275 | 0.375 | 0.218 | 0.25 | 0.343 | 0.313 | 0.496 | 0.279 | 0.443 | 0.412 | 0.337 | 0.369 | 0.393 | 0.327 | 0.27 | 0.28 | 0.418 | 0.315 | 0.113 | 0.319 | 0.359 | 0.36 | 0.432 | 0.406 | 0.434 | 0.387 | 0.393 | 0.182 | 0.472 | 0.328 | 0.453 | 0.248 | 0.392 | 0.303 | 0.447 | 0.383 | 0.365 | 0.413 | 0.432 | 0.318 | 0.351 | 0.359 | 0.264 | 0.388 | 0.449 | 0.424 | 0.394 | 0.291 | 0.36 | 0.356 | 0.37 | 0.429 | 0.326 | 0.292 | 0.338 | 0.474 | 0.36 | 0.48 | 0.467 | 0.227 | 0.278 | 0.421 | 0.307 | 0.362 | 0.315 | 0.46 | 0.398 | 0.349 | 0.353 | 0.379 | 0.394 | 0.404 | 0.316 | 0.401 | 0.05 | 0.472 | 0.273 | 0.267 | 0.395 |
| 33 | 0.375 | 0.483 | 0.288 | 0.384 | 0.368 | 0.463 | 0.453 | 0.398 | 0.427 | 0.25 | 0.526 | 0.367 | 0.293 | 0.377 | 0.431 | 0.433 | 0.276 | 0.375 | 0.219 | 0.251 | 0.343 | 0.313 | 0.496 | 0.279 | 0.443 | 0.412 | 0.337 | 0.369 | 0.393 | 0.327 | 0.271 | 0.28 | 0.418 | 0.315 | 0.12 | 0.319 | 0.359 | 0.36 | 0.432 | 0.406 | 0.434 | 0.387 | 0.393 | 0.186 | 0.472 | 0.328 | 0.453 | 0.248 | 0.392 | 0.303 | 0.447 | 0.383 | 0.365 | 0.413 | 0.432 | 0.318 | 0.351 | 0.359 | 0.265 | 0.388 | 0.449 | 0.424 | 0.394 | 0.291 | 0.36 | 0.356 | 0.37 | 0.429 | 0.326 | 0.292 | 0.338 | 0.474 | 0.36 | 0.48 | 0.467 | 0.228 | 0.278 | 0.421 | 0.307 | 0.362 | 0.315 | 0.46 | 0.398 | 0.349 | 0.353 | 0.379 | 0.394 | 0.404 | 0.316 | 0.401 | 0.054 | 0.472 | 0.273 | 0.267 | 0.395 |
| 34 | 0.375 | 0.483 | 0.288 | 0.384 | 0.368 | 0.463 | 0.453 | 0.398 | 0.427 | 0.25 | 0.526 | 0.367 | 0.293 | 0.377 | 0.431 | 0.433 | 0.276 | 0.375 | 0.221 | 0.251 | 0.343 | 0.313 | 0.496 | 0.279 | 0.443 | 0.412 | 0.337 | 0.369 | 0.393 | 0.327 | 0.271 | 0.28 | 0.418 | 0.315 | 0.126 | 0.319 | 0.359 | 0.36 | 0.432 | 0.406 | 0.434 | 0.387 | 0.393 | 0.189 | 0.472 | 0.328 | 0.453 | 0.249 | 0.392 | 0.303 | 0.447 | 0.383 | 0.365 | 0.413 | 0.432 | 0.318 | 0.351 | 0.359 | 0.265 | 0.388 | 0.449 | 0.424 | 0.394 | 0.291 | 0.36 | 0.356 | 0.37 | 0.429 | 0.326 | 0.292 | 0.338 | 0.474 | 0.36 | 0.48 | 0.467 | 0.229 | 0.279 | 0.421 | 0.307 | 0.362 | 0.315 | 0.46 | 0.398 | 0.349 | 0.353 | 0.379 | 0.394 | 0.404 | 0.316 | 0.401 | 0.059 | 0.472 | 0.273 | 0.267 | 0.395 |
| 35 | 0.375 | 0.483 | 0.288 | 0.384 | 0.368 | 0.463 | 0.453 | 0.398 | 0.427 | 0.25 | 0.526 | 0.367 | 0.293 | 0.377 | 0.431 | 0.433 | 0.276 | 0.375 | 0.221 | 0.251 | 0.343 | 0.313 | 0.496 | 0.279 | 0.443 | 0.412 | 0.337 | 0.369 | 0.393 | 0.327 | 0.271 | 0.28 | 0.418 | 0.315 | 0.132 | 0.319 | 0.359 | 0.36 | 0.432 | 0.406 | 0.434 | 0.387 | 0.393 | 0.191 | 0.472 | 0.328 | 0.453 | 0.249 | 0.392 | 0.303 | 0.447 | 0.383 | 0.365 | 0.413 | 0.432 | 0.318 | 0.351 | 0.359 | 0.265 | 0.388 | 0.449 | 0.424 | 0.394 | 0.291 | 0.36 | 0.356 | 0.37 | 0.429 | 0.326 | 0.293 | 0.338 | 0.474 | 0.36 | 0.48 | 0.467 | 0.23 | 0.279 | 0.421 | 0.307 | 0.362 | 0.315 | 0.46 | 0.398 | 0.349 | 0.353 | 0.379 | 0.394 | 0.404 | 0.316 | 0.401 | 0.064 | 0.472 | 0.273 | 0.267 | 0.395 |
| 36 | 0.375 | 0.483 | 0.288 | 0.384 | 0.368 | 0.463 | 0.453 | 0.398 | 0.427 | 0.251 | 0.526 | 0.367 | 0.293 | 0.377 | 0.431 | 0.433 | 0.276 | 0.375 | 0.222 | 0.251 | 0.343 | 0.313 | 0.496 | 0.279 | 0.443 | 0.412 | 0.337 | 0.369 | 0.393 | 0.327 | 0.271 | 0.28 | 0.418 | 0.315 | 0.137 | 0.319 | 0.359 | 0.36 | 0.432 | 0.406 | 0.434 | 0.387 | 0.393 | 0.193 | 0.472 | 0.328 | 0.453 | 0.249 | 0.392 | 0.303 | 0.447 | 0.383 | 0.365 | 0.413 | 0.432 | 0.318 | 0.351 | 0.359 | 0.265 | 0.388 | 0.449 | 0.424 | 0.394 | 0.291 | 0.36 | 0.356 | 0.37 | 0.429 | 0.326 | 0.293 | 0.338 | 0.474 | 0.36 | 0.48 | 0.467 | 0.23 | 0.279 | 0.421 | 0.307 | 0.362 | 0.315 | 0.46 | 0.398 | 0.349 | 0.353 | 0.379 | 0.394 | 0.404 | 0.316 | 0.401 | 0.068 | 0.472 | 0.273 | 0.267 | 0.395 |